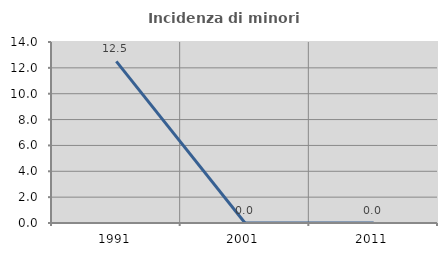
| Category | Incidenza di minori stranieri |
|---|---|
| 1991.0 | 12.5 |
| 2001.0 | 0 |
| 2011.0 | 0 |